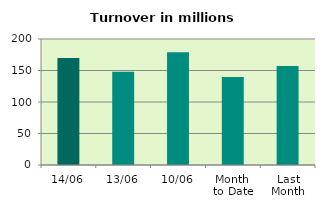
| Category | Series 0 |
|---|---|
| 14/06 | 170.024 |
| 13/06 | 147.962 |
| 10/06 | 179.038 |
| Month 
to Date | 139.817 |
| Last
Month | 157.265 |